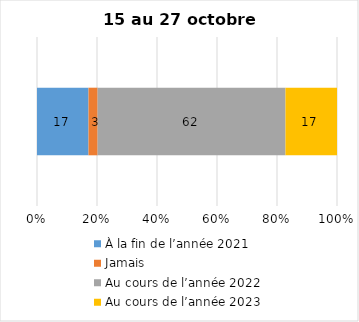
| Category | À la fin de l’année 2021 | Jamais | Au cours de l’année 2022 | Au cours de l’année 2023 |
|---|---|---|---|---|
| 0 | 17 | 3 | 62 | 17 |